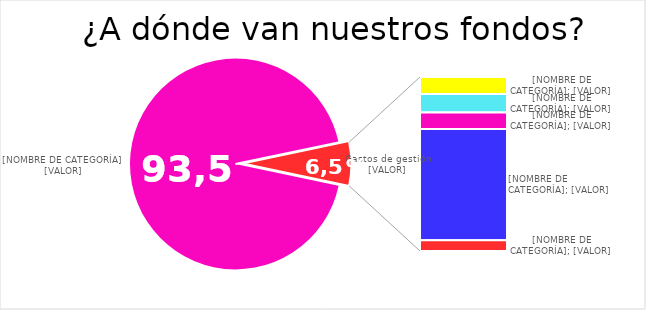
| Category | Series 0 |
|---|---|
| Proyectos | 4353.94 |
| Web | -30.06 |
| Papelería | -32.45 |
| Telefonía | -29.5 |
| Mantenimiento de cuentas bancarias | -196.41 |
| Otros | -18.94 |